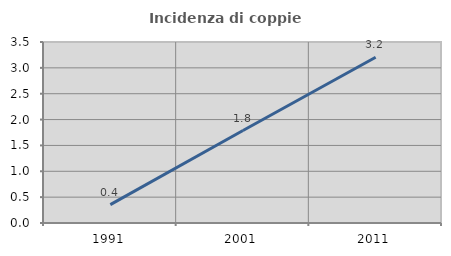
| Category | Incidenza di coppie miste |
|---|---|
| 1991.0 | 0.355 |
| 2001.0 | 1.788 |
| 2011.0 | 3.204 |